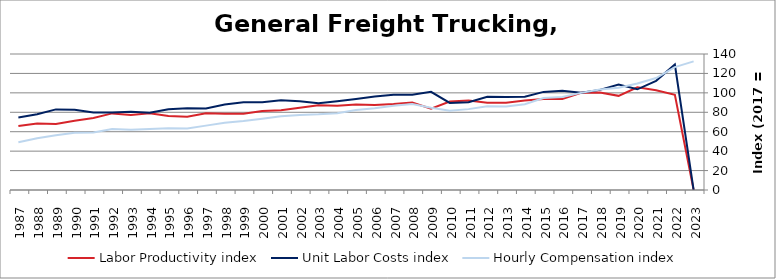
| Category | Labor Productivity index | Unit Labor Costs index | Hourly Compensation index |
|---|---|---|---|
| 2023.0 | 0 | 0 | 132.428 |
| 2022.0 | 97.973 | 129.134 | 126.517 |
| 2021.0 | 102.596 | 112.35 | 115.267 |
| 2020.0 | 105.721 | 103.655 | 109.586 |
| 2019.0 | 96.918 | 108.547 | 105.202 |
| 2018.0 | 100.425 | 103.077 | 103.515 |
| 2017.0 | 100 | 100 | 100 |
| 2016.0 | 93.791 | 102.046 | 95.711 |
| 2015.0 | 93.73 | 100.993 | 94.66 |
| 2014.0 | 92.008 | 95.954 | 88.286 |
| 2013.0 | 89.891 | 95.709 | 86.035 |
| 2012.0 | 89.859 | 96.069 | 86.326 |
| 2011.0 | 92.041 | 90.45 | 83.251 |
| 2010.0 | 91.042 | 89.579 | 81.554 |
| 2009.0 | 83.816 | 101.042 | 84.689 |
| 2008.0 | 90.1 | 98.121 | 88.407 |
| 2007.0 | 88.427 | 97.981 | 86.642 |
| 2006.0 | 87.419 | 96.282 | 84.168 |
| 2005.0 | 87.968 | 93.655 | 82.387 |
| 2004.0 | 86.655 | 91.3 | 79.116 |
| 2003.0 | 87.263 | 89.311 | 77.936 |
| 2002.0 | 84.642 | 91.264 | 77.247 |
| 2001.0 | 82.112 | 92.4 | 75.872 |
| 2000.0 | 81.231 | 90.396 | 73.43 |
| 1999.0 | 78.602 | 90.325 | 70.997 |
| 1998.0 | 78.595 | 88.08 | 69.227 |
| 1997.0 | 78.986 | 83.913 | 66.279 |
| 1996.0 | 75.384 | 84.063 | 63.37 |
| 1995.0 | 76.278 | 83.182 | 63.45 |
| 1994.0 | 78.939 | 79.514 | 62.768 |
| 1993.0 | 77.141 | 80.481 | 62.084 |
| 1992.0 | 78.856 | 79.758 | 62.894 |
| 1991.0 | 74.197 | 79.783 | 59.197 |
| 1990.0 | 71.341 | 82.601 | 58.929 |
| 1989.0 | 67.9 | 82.972 | 56.338 |
| 1988.0 | 68.444 | 77.963 | 53.361 |
| 1987.0 | 65.843 | 74.523 | 49.068 |